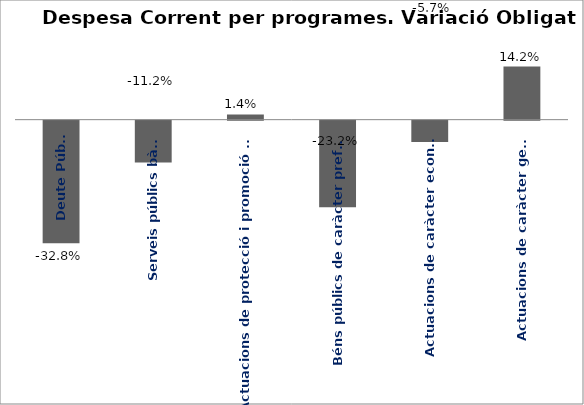
| Category | Series 0 |
|---|---|
| Deute Públic | -0.328 |
| Serveis públics bàsics | -0.112 |
| Actuacions de protecció i promoció social | 0.014 |
| Béns públics de caràcter preferent | -0.232 |
| Actuacions de caràcter econòmic | -0.057 |
| Actuacions de caràcter general | 0.142 |